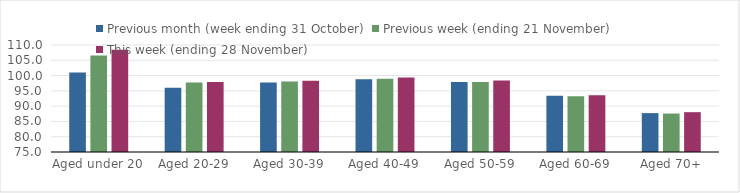
| Category | Previous month (week ending 31 October) | Previous week (ending 21 November) | This week (ending 28 November) |
|---|---|---|---|
| Aged under 20 | 101.04 | 106.54 | 108.48 |
| Aged 20-29 | 96 | 97.7 | 97.86 |
| Aged 30-39 | 97.77 | 98.08 | 98.29 |
| Aged 40-49 | 98.8 | 98.99 | 99.4 |
| Aged 50-59 | 97.87 | 97.91 | 98.39 |
| Aged 60-69 | 93.43 | 93.22 | 93.57 |
| Aged 70+ | 87.72 | 87.58 | 88.03 |